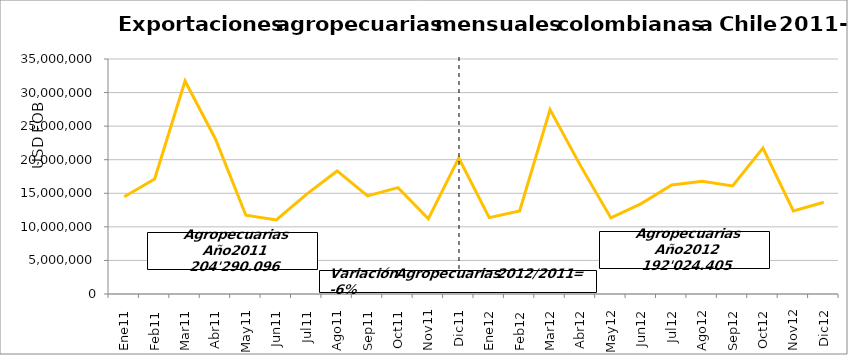
| Category | Series 0 |
|---|---|
| 0 | 14477225.56 |
| 1 | 17131794.02 |
| 2 | 31720658.79 |
| 3 | 23093421.2 |
| 4 | 11734888.26 |
| 5 | 11030438.82 |
| 6 | 14876275.75 |
| 7 | 18326686.69 |
| 8 | 14620610.6 |
| 9 | 15838499.23 |
| 10 | 11202569.96 |
| 11 | 20237027.61 |
| 12 | 11375811 |
| 13 | 12372108 |
| 14 | 27476255 |
| 15 | 19117448 |
| 16 | 11330179 |
| 17 | 13465909 |
| 18 | 16225018 |
| 19 | 16799598 |
| 20 | 16098752 |
| 21 | 21721258 |
| 22 | 12372280 |
| 23 | 13669789 |